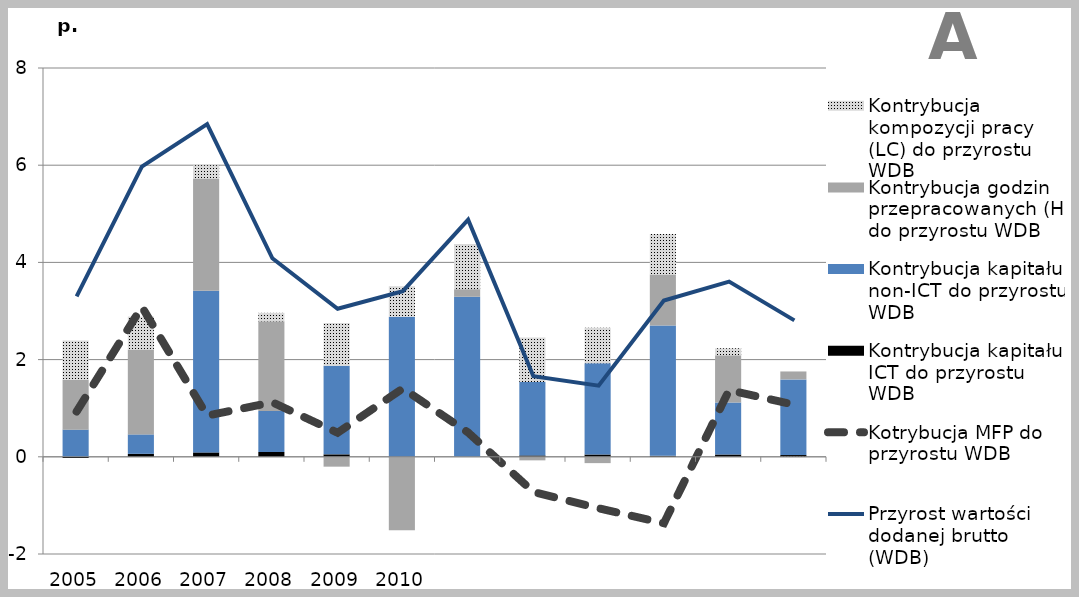
| Category | Kontrybucja kapitału ICT do przyrostu WDB | Kontrybucja kapitału non-ICT do przyrostu WDB | Kontrybucja godzin przepracowanych (H) do przyrostu WDB | Kontrybucja kompozycji pracy (LC) do przyrostu WDB |
|---|---|---|---|---|
| 2005.0 | -0.024 | 0.559 | 1.025 | 0.81 |
| 2006.0 | 0.061 | 0.4 | 1.746 | 0.679 |
| 2007.0 | 0.09 | 3.329 | 2.308 | 0.272 |
| 2008.0 | 0.099 | 0.844 | 1.845 | 0.174 |
| 2009.0 | 0.05 | 1.823 | -0.203 | 0.881 |
| 2010.0 | -0.009 | 2.884 | -1.5 | 0.626 |